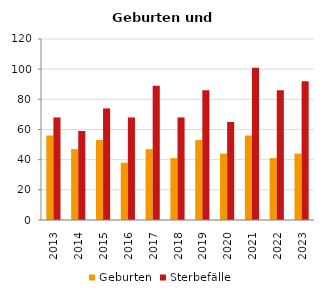
| Category | Geburten | Sterbefälle |
|---|---|---|
| 2013.0 | 56 | 68 |
| 2014.0 | 47 | 59 |
| 2015.0 | 53 | 74 |
| 2016.0 | 38 | 68 |
| 2017.0 | 47 | 89 |
| 2018.0 | 41 | 68 |
| 2019.0 | 53 | 86 |
| 2020.0 | 44 | 65 |
| 2021.0 | 56 | 101 |
| 2022.0 | 41 | 86 |
| 2023.0 | 44 | 92 |